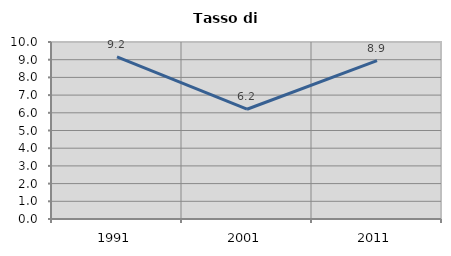
| Category | Tasso di disoccupazione   |
|---|---|
| 1991.0 | 9.163 |
| 2001.0 | 6.202 |
| 2011.0 | 8.943 |